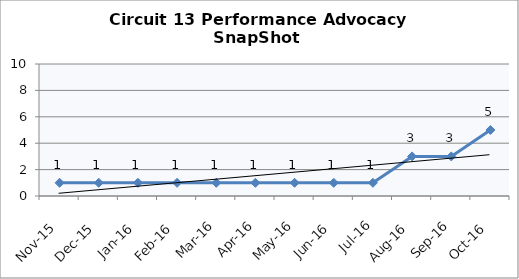
| Category | Circuit 13 |
|---|---|
| Nov-15 | 1 |
| Dec-15 | 1 |
| Jan-16 | 1 |
| Feb-16 | 1 |
| Mar-16 | 1 |
| Apr-16 | 1 |
| May-16 | 1 |
| Jun-16 | 1 |
| Jul-16 | 1 |
| Aug-16 | 3 |
| Sep-16 | 3 |
| Oct-16 | 5 |